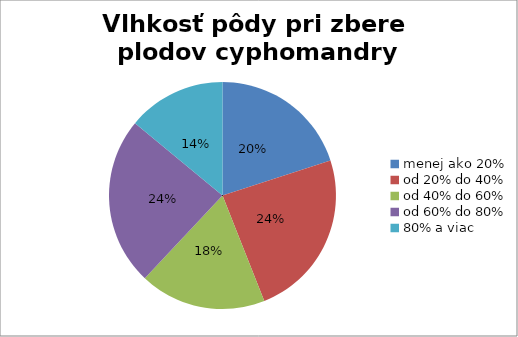
| Category | Series 0 |
|---|---|
| menej ako 20% | 10 |
| od 20% do 40% | 12 |
| od 40% do 60% | 9 |
| od 60% do 80% | 12 |
| 80% a viac | 7 |